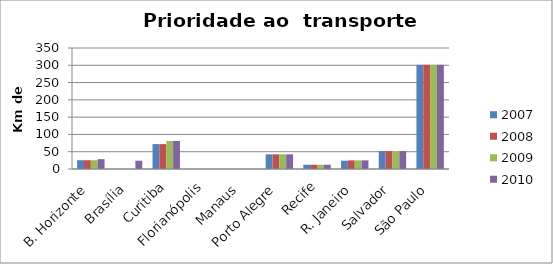
| Category | 2007 | 2008 | 2009 | 2010 |
|---|---|---|---|---|
| B. Horizonte | 25.4 | 25.4 | 25.4 | 28.4 |
| Brasília | 0 | 0 | 0 | 24 |
| Curitiba | 72 | 72 | 81 | 81 |
| Florianópolis | 0 | 0 | 0 | 0 |
| Manaus | 0 | 0 | 0 | 0 |
| Porto Alegre | 42.5 | 42.5 | 42.5 | 42.5 |
| Recife | 12.3 | 12.3 | 12.3 | 12.3 |
| R. Janeiro | 24 | 25 | 25 | 25 |
| Salvador | 51.8 | 51.8 | 51.8 | 51.8 |
| São Paulo | 301.32 | 301.32 | 301.32 | 301.32 |